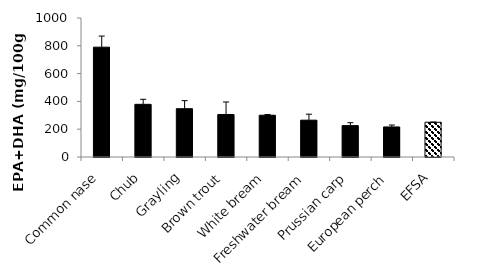
| Category | EPA+DHA |
|---|---|
| Common nase | 790.036 |
| Chub | 379.04 |
| Grayling | 347.45 |
| Brown trout | 305.824 |
| White bream | 300.536 |
| Freshwater bream | 265.036 |
| Prussian carp | 225.747 |
| European perch | 216.174 |
| EFSA | 250 |